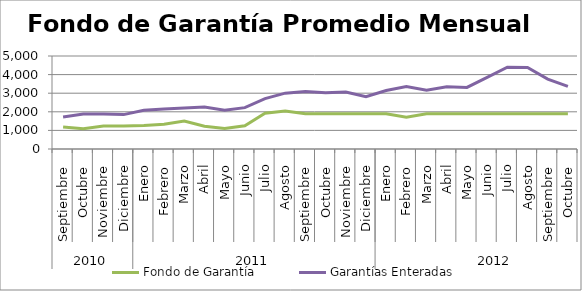
| Category | Fondo de Garantía | Garantías Enteradas |
|---|---|---|
| 0 | 1186.765 | 1723.136 |
| 1 | 1091.277 | 1878.561 |
| 2 | 1240.142 | 1886.493 |
| 3 | 1233.184 | 1848.941 |
| 4 | 1267.175 | 2079.773 |
| 5 | 1328.315 | 2151.804 |
| 6 | 1507.218 | 2200.488 |
| 7 | 1222.61 | 2253.818 |
| 8 | 1097.438 | 2081.441 |
| 9 | 1248.758 | 2223.666 |
| 10 | 1917.982 | 2706.525 |
| 11 | 2038.339 | 3002.384 |
| 12 | 1900.513 | 3095.395 |
| 13 | 1900.513 | 3029.373 |
| 14 | 1900.513 | 3060.179 |
| 15 | 1900.513 | 2809.042 |
| 16 | 1896.798 | 3141.641 |
| 17 | 1714.423 | 3362.648 |
| 18 | 1900.513 | 3154.118 |
| 19 | 1900.513 | 3348.058 |
| 20 | 1898.685 | 3308.859 |
| 21 | 1900.513 | 3850.375 |
| 22 | 1900.513 | 4400.539 |
| 23 | 1895.388 | 4383.327 |
| 24 | 1900.513 | 3757.632 |
| 25 | 1900.513 | 3362.932 |